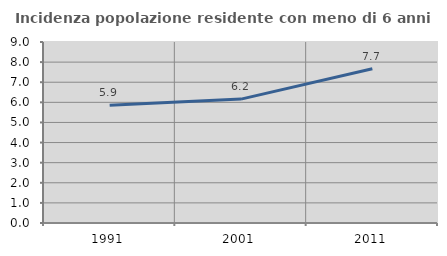
| Category | Incidenza popolazione residente con meno di 6 anni |
|---|---|
| 1991.0 | 5.856 |
| 2001.0 | 6.16 |
| 2011.0 | 7.67 |